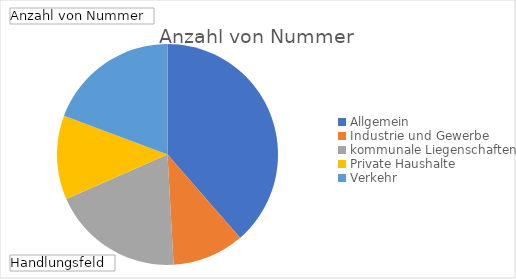
| Category | Ergebnis |
|---|---|
| Allgemein | 22 |
| Industrie und Gewerbe | 6 |
| kommunale Liegenschaften | 11 |
| Private Haushalte | 7 |
| Verkehr | 11 |